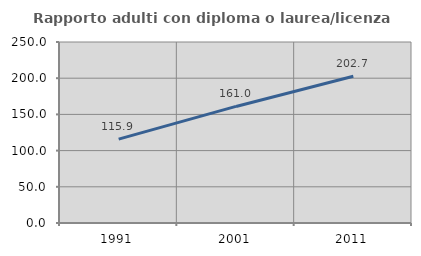
| Category | Rapporto adulti con diploma o laurea/licenza media  |
|---|---|
| 1991.0 | 115.925 |
| 2001.0 | 161.012 |
| 2011.0 | 202.743 |